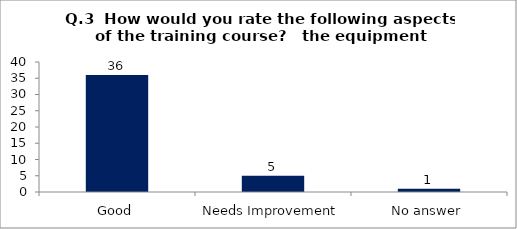
| Category | Q.3  How would you rate the following aspects of the training course?  |
|---|---|
| Good | 36 |
| Needs Improvement | 5 |
| No answer | 1 |